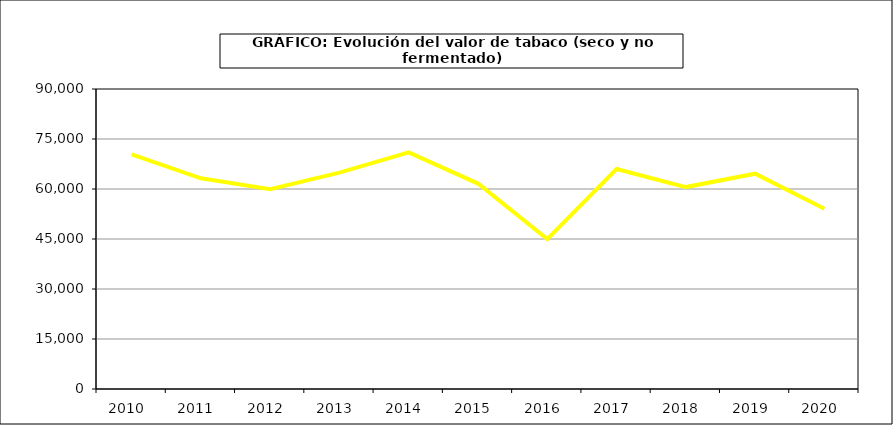
| Category | Valor |
|---|---|
| 2010.0 | 70384.847 |
| 2011.0 | 63219.669 |
| 2012.0 | 59963.648 |
| 2013.0 | 64900.043 |
| 2014.0 | 70983.122 |
| 2015.0 | 61634.5 |
| 2016.0 | 44972.9 |
| 2017.0 | 65979.385 |
| 2018.0 | 60574.168 |
| 2019.0 | 64589.269 |
| 2020.0 | 54068.528 |